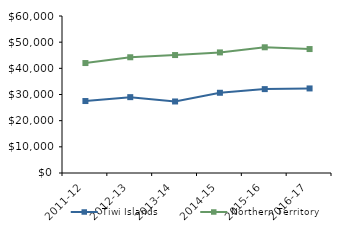
| Category | Tiwi Islands | Northern Territory |
|---|---|---|
| 2011-12 | 27503.75 | 42021 |
| 2012-13 | 28987.89 | 44232.02 |
| 2013-14 | 27337 | 45075.51 |
| 2014-15 | 30661 | 46083.65 |
| 2015-16 | 32056 | 48046.27 |
| 2016-17 | 32316.62 | 47367.05 |